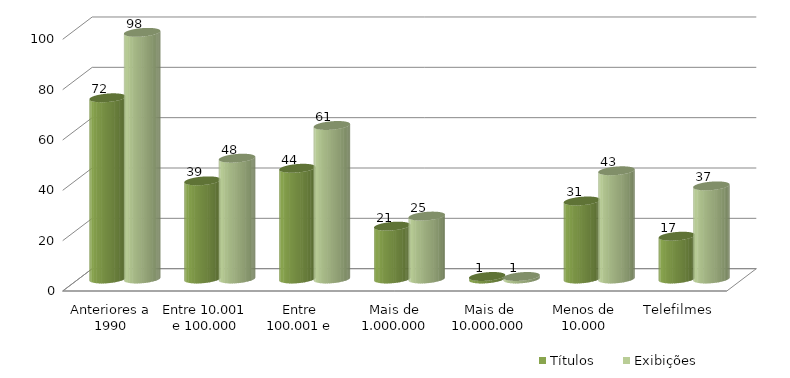
| Category | Títulos | Exibições |
|---|---|---|
| Anteriores a 1990 | 72 | 98 |
| Entre 10.001 e 100.000 | 39 | 48 |
| Entre 100.001 e 1.000.000 | 44 | 61 |
| Mais de 1.000.000 | 21 | 25 |
| Mais de 10.000.000 | 1 | 1 |
| Menos de 10.000 | 31 | 43 |
| Telefilmes | 17 | 37 |